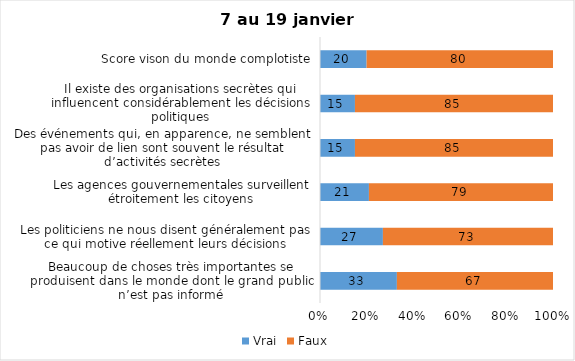
| Category | Vrai | Faux |
|---|---|---|
| Beaucoup de choses très importantes se produisent dans le monde dont le grand public n’est pas informé | 33 | 67 |
| Les politiciens ne nous disent généralement pas ce qui motive réellement leurs décisions | 27 | 73 |
| Les agences gouvernementales surveillent étroitement les citoyens | 21 | 79 |
| Des événements qui, en apparence, ne semblent pas avoir de lien sont souvent le résultat d’activités secrètes | 15 | 85 |
| Il existe des organisations secrètes qui influencent considérablement les décisions politiques | 15 | 85 |
| Score vison du monde complotiste | 20 | 80 |